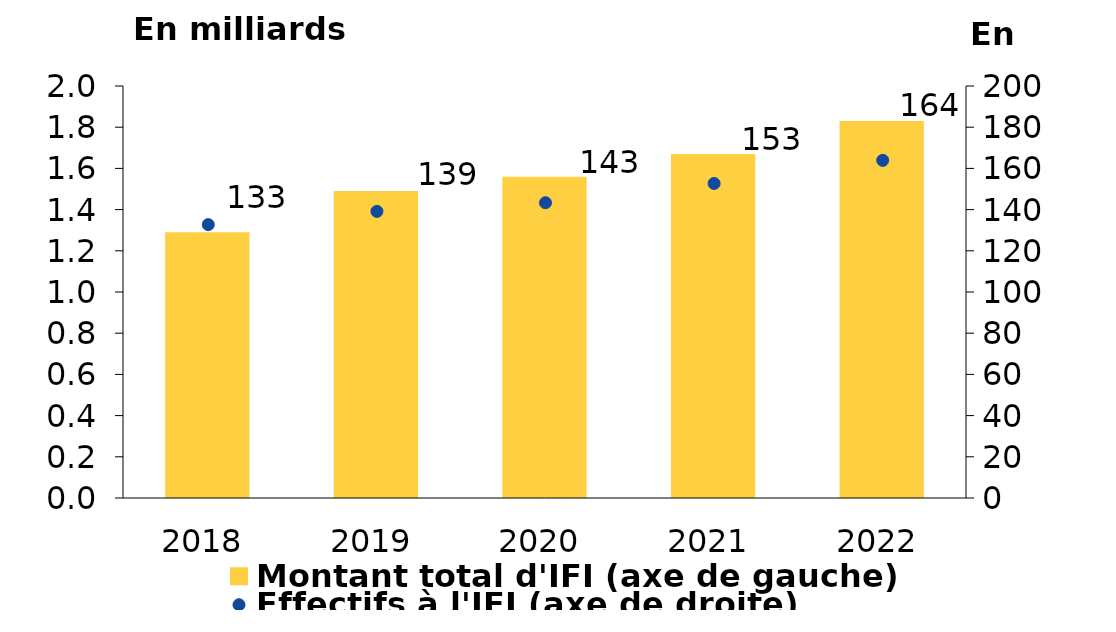
| Category | Montant total d'IFI (axe de gauche) |
|---|---|
| 2018.0 | 1.29 |
| 2019.0 | 1.49 |
| 2020.0 | 1.56 |
| 2021.0 | 1.67 |
| 2022.0 | 1.83 |